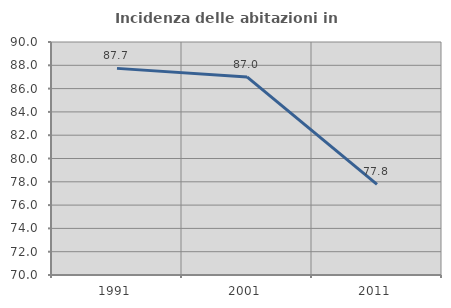
| Category | Incidenza delle abitazioni in proprietà  |
|---|---|
| 1991.0 | 87.736 |
| 2001.0 | 87 |
| 2011.0 | 77.778 |